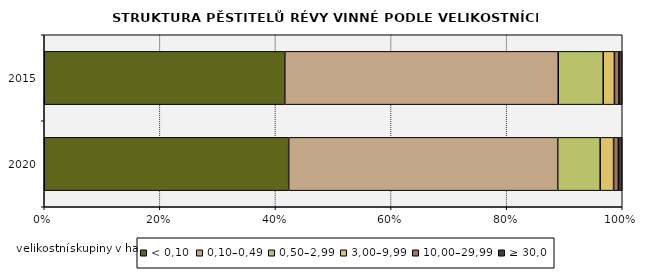
| Category | < 0,10 | 0,10–0,49 | 0,50–2,99 | 3,00–9,99 | 10,00–29,99 | ≥ 30,0 |
|---|---|---|---|---|---|---|
| 2020.0 | 6996 | 7698 | 1215 | 385 | 136 | 111 |
| 2015.0 | 7581 | 8617 | 1418 | 353 | 140 | 107 |